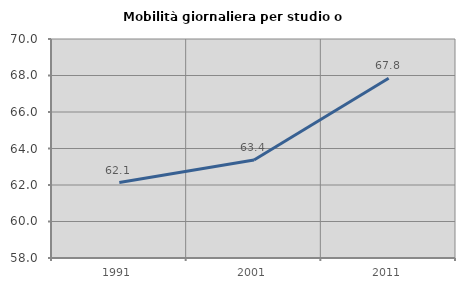
| Category | Mobilità giornaliera per studio o lavoro |
|---|---|
| 1991.0 | 62.134 |
| 2001.0 | 63.371 |
| 2011.0 | 67.85 |